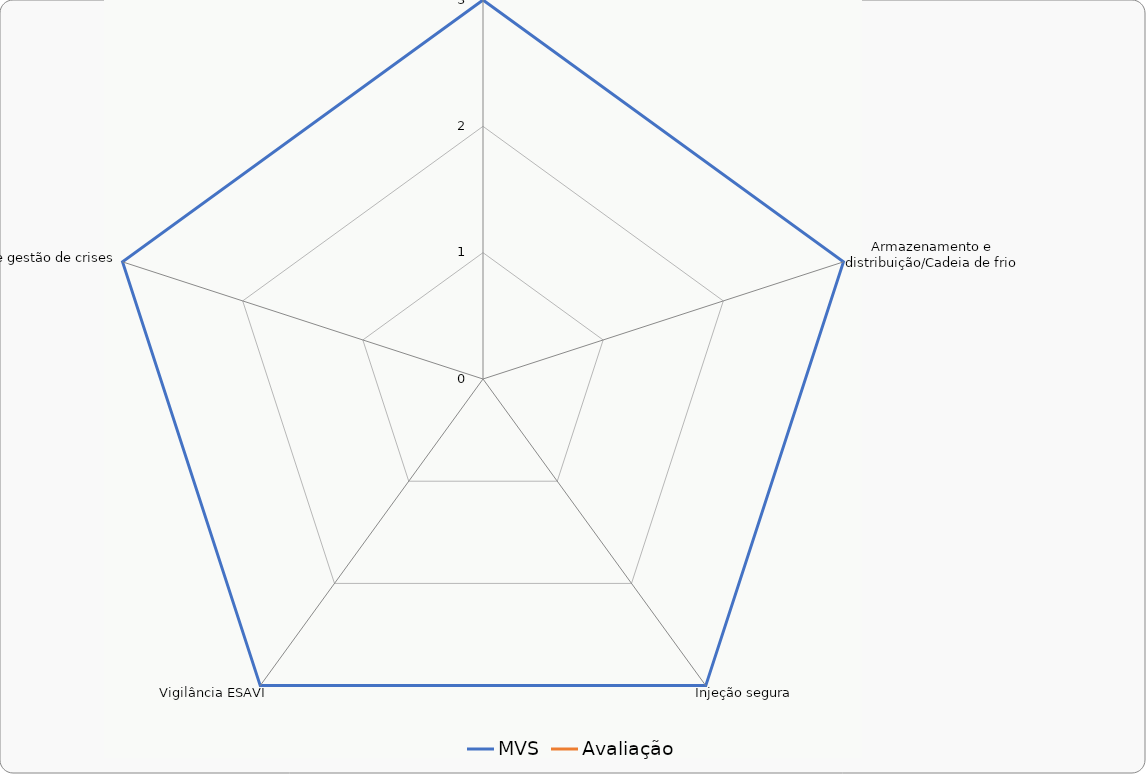
| Category | MVS | Avaliação |
|---|---|---|
| Vacinas de qualidade | 3 | 0 |
| Armazenamento e distribuição/Cadeia de frio | 3 | 0 |
| Injeção segura | 3 | 0 |
| Vigilância ESAVI | 3 | 0 |
| Prevenção e gestão de crises | 3 | 0 |